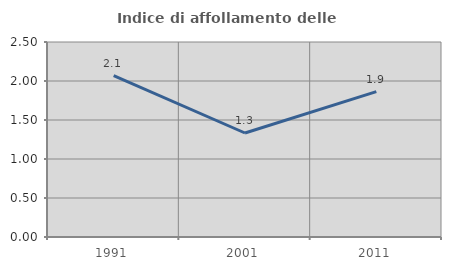
| Category | Indice di affollamento delle abitazioni  |
|---|---|
| 1991.0 | 2.069 |
| 2001.0 | 1.333 |
| 2011.0 | 1.863 |